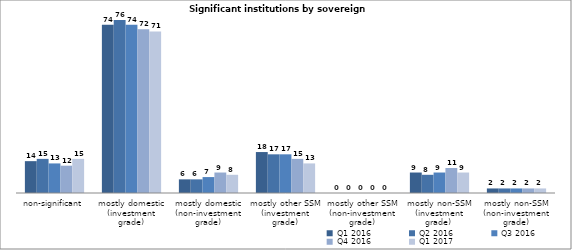
| Category | Q1 2016 | Q2 2016 | Q3 2016 | Q4 2016 | Q1 2017 |
|---|---|---|---|---|---|
| non-significant | 14 | 15 | 13 | 12 | 15 |
| mostly domestic
(investment grade) | 74 | 76 | 74 | 72 | 71 |
| mostly domestic
(non-investment grade) | 6 | 6 | 7 | 9 | 8 |
| mostly other SSM
(investment grade) | 18 | 17 | 17 | 15 | 13 |
| mostly other SSM
(non-investment grade) | 0 | 0 | 0 | 0 | 0 |
| mostly non-SSM
(investment grade)  | 9 | 8 | 9 | 11 | 9 |
| mostly non-SSM
(non-investment grade) | 2 | 2 | 2 | 2 | 2 |